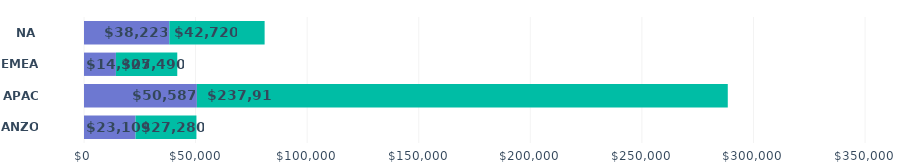
| Category | New Business  | Expansion  |
|---|---|---|
| 0 | 23109 | 27280 |
| 1 | 50587 | 237916 |
| 2 | 14305 | 27490 |
| 3 | 38223 | 42720 |